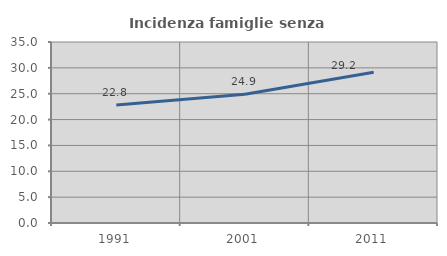
| Category | Incidenza famiglie senza nuclei |
|---|---|
| 1991.0 | 22.831 |
| 2001.0 | 24.888 |
| 2011.0 | 29.155 |